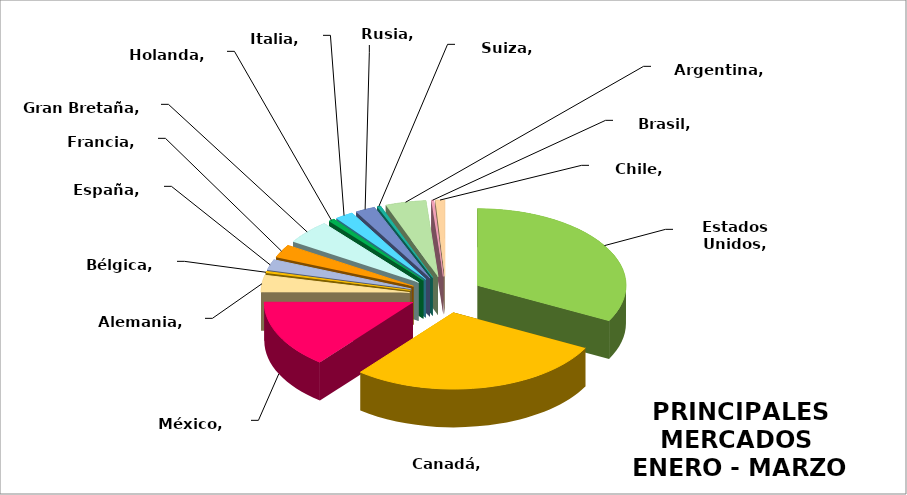
| Category | Series 0 |
|---|---|
| Estados Unidos | 0.31 |
| Canadá | 0.267 |
| México | 0.136 |
| Alemania | 0.034 |
| Bélgica | 0.003 |
| España | 0.021 |
| Francia | 0.026 |
| Gran Bretaña | 0.048 |
| Holanda | 0.006 |
| Italia | 0.019 |
| Rusia | 0.021 |
| Suiza | 0.004 |
| Argentina | 0.042 |
| Brasil | 0.003 |
| Chile | 0.01 |